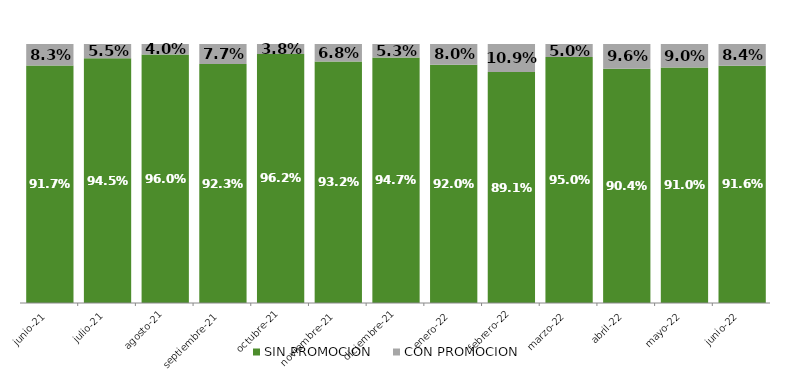
| Category | SIN PROMOCION   | CON PROMOCION   |
|---|---|---|
| 2021-06-01 | 0.917 | 0.083 |
| 2021-07-01 | 0.945 | 0.055 |
| 2021-08-01 | 0.96 | 0.04 |
| 2021-09-01 | 0.923 | 0.077 |
| 2021-10-01 | 0.962 | 0.038 |
| 2021-11-01 | 0.932 | 0.068 |
| 2021-12-01 | 0.947 | 0.053 |
| 2022-01-01 | 0.92 | 0.08 |
| 2022-02-01 | 0.891 | 0.109 |
| 2022-03-01 | 0.95 | 0.05 |
| 2022-04-01 | 0.904 | 0.096 |
| 2022-05-01 | 0.91 | 0.09 |
| 2022-06-01 | 0.916 | 0.084 |